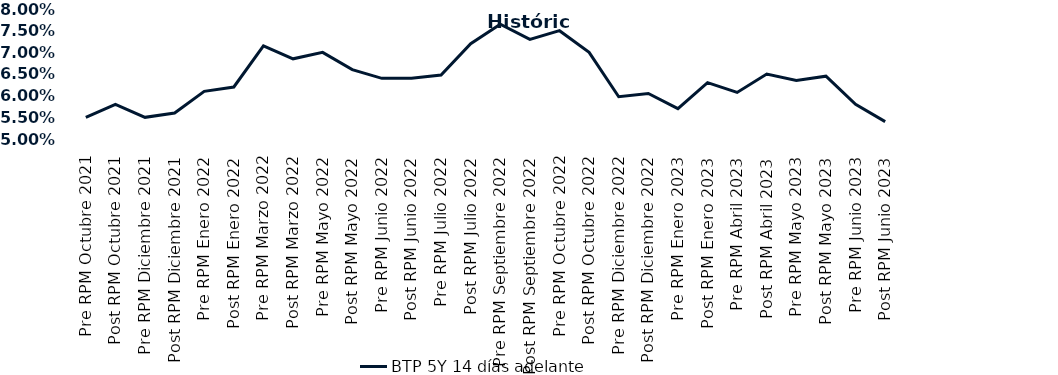
| Category | BTP 5Y 14 días adelante |
|---|---|
| Pre RPM Octubre 2021 | 0.055 |
| Post RPM Octubre 2021 | 0.058 |
| Pre RPM Diciembre 2021 | 0.055 |
| Post RPM Diciembre 2021 | 0.056 |
| Pre RPM Enero 2022 | 0.061 |
| Post RPM Enero 2022 | 0.062 |
| Pre RPM Marzo 2022 | 0.072 |
| Post RPM Marzo 2022 | 0.068 |
| Pre RPM Mayo 2022 | 0.07 |
| Post RPM Mayo 2022 | 0.066 |
| Pre RPM Junio 2022 | 0.064 |
| Post RPM Junio 2022 | 0.064 |
| Pre RPM Julio 2022 | 0.065 |
| Post RPM Julio 2022 | 0.072 |
| Pre RPM Septiembre 2022 | 0.076 |
| Post RPM Septiembre 2022 | 0.073 |
| Pre RPM Octubre 2022 | 0.075 |
| Post RPM Octubre 2022 | 0.07 |
| Pre RPM Diciembre 2022 | 0.06 |
| Post RPM Diciembre 2022 | 0.06 |
| Pre RPM Enero 2023 | 0.057 |
| Post RPM Enero 2023 | 0.063 |
| Pre RPM Abril 2023 | 0.061 |
| Post RPM Abril 2023 | 0.065 |
| Pre RPM Mayo 2023 | 0.064 |
| Post RPM Mayo 2023 | 0.064 |
| Pre RPM Junio 2023 | 0.058 |
| Post RPM Junio 2023 | 0.054 |